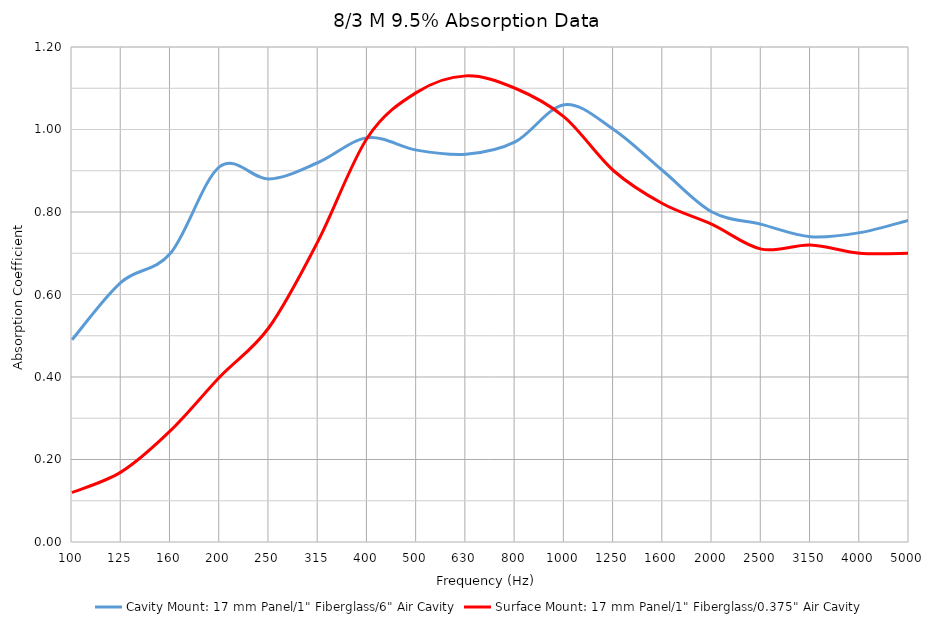
| Category | Cavity Mount: 17 mm Panel/1" Fiberglass/6" Air Cavity | Surface Mount: 17 mm Panel/1" Fiberglass/0.375" Air Cavity |
|---|---|---|
| 100.0 | 0.49 | 0.12 |
| 125.0 | 0.63 | 0.17 |
| 160.0 | 0.7 | 0.27 |
| 200.0 | 0.91 | 0.4 |
| 250.0 | 0.88 | 0.52 |
| 315.0 | 0.92 | 0.73 |
| 400.0 | 0.98 | 0.98 |
| 500.0 | 0.95 | 1.09 |
| 630.0 | 0.94 | 1.13 |
| 800.0 | 0.97 | 1.1 |
| 1000.0 | 1.06 | 1.03 |
| 1250.0 | 1 | 0.9 |
| 1600.0 | 0.9 | 0.82 |
| 2000.0 | 0.8 | 0.77 |
| 2500.0 | 0.77 | 0.71 |
| 3150.0 | 0.74 | 0.72 |
| 4000.0 | 0.75 | 0.7 |
| 5000.0 | 0.78 | 0.7 |